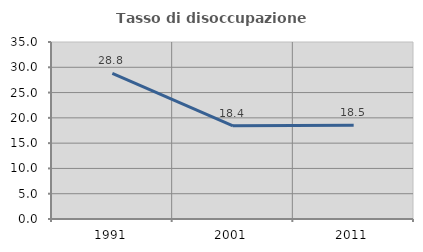
| Category | Tasso di disoccupazione giovanile  |
|---|---|
| 1991.0 | 28.796 |
| 2001.0 | 18.433 |
| 2011.0 | 18.519 |